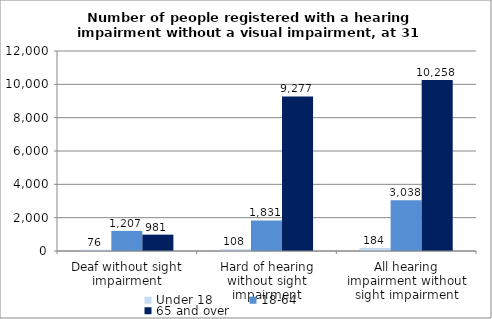
| Category | Under 18 | 18-64 | 65 and over |
|---|---|---|---|
| Deaf without sight impairment | 76 | 1207 | 981 |
| Hard of hearing without sight impairment | 108 | 1831 | 9277 |
| All hearing impairment without sight impairment | 184 | 3038 | 10258 |